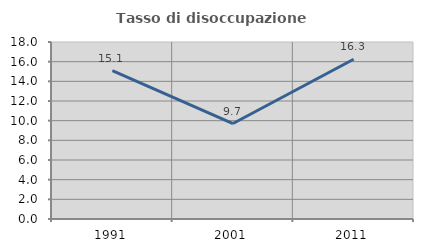
| Category | Tasso di disoccupazione giovanile  |
|---|---|
| 1991.0 | 15.079 |
| 2001.0 | 9.709 |
| 2011.0 | 16.25 |